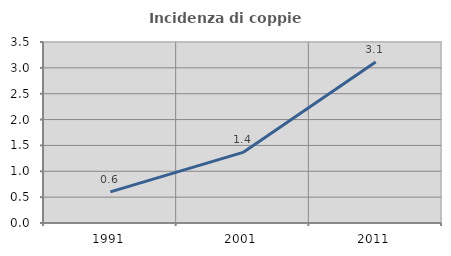
| Category | Incidenza di coppie miste |
|---|---|
| 1991.0 | 0.601 |
| 2001.0 | 1.365 |
| 2011.0 | 3.113 |